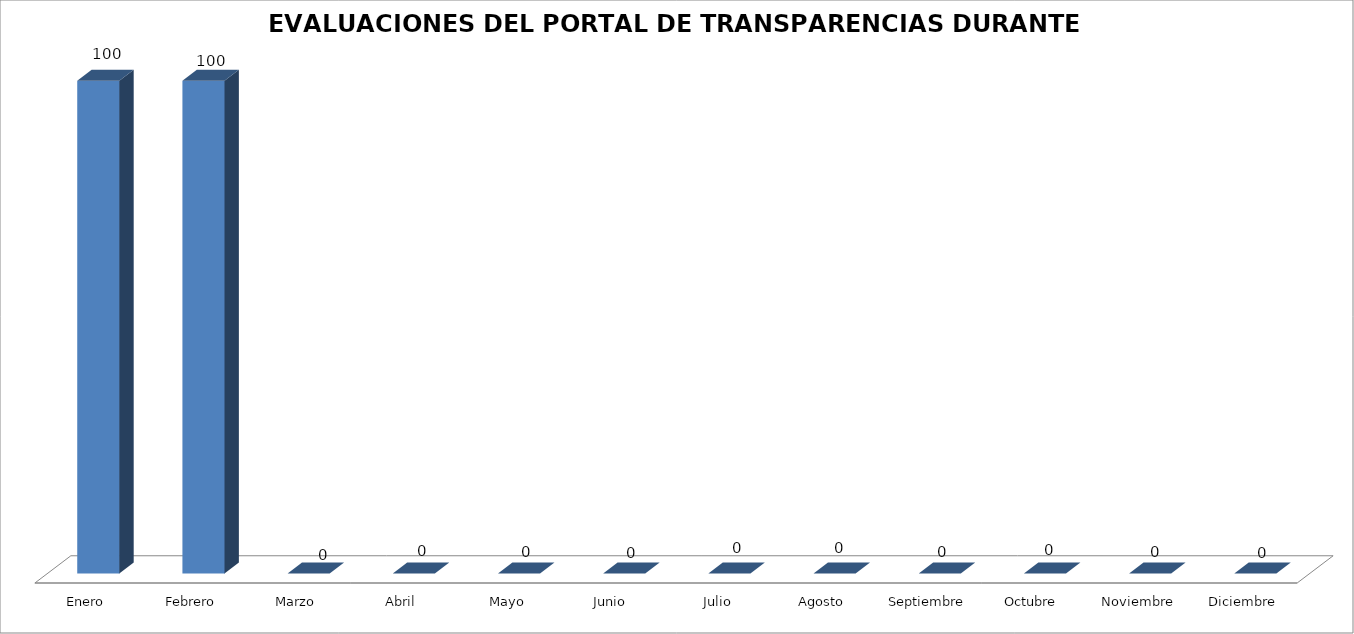
| Category | Series 0 |
|---|---|
| Enero | 100 |
| Febrero | 100 |
| Marzo | 0 |
| Abril | 0 |
| Mayo | 0 |
| Junio  | 0 |
| Julio | 0 |
| Agosto | 0 |
| Septiembre | 0 |
| Octubre  | 0 |
| Noviembre | 0 |
| Diciembre | 0 |